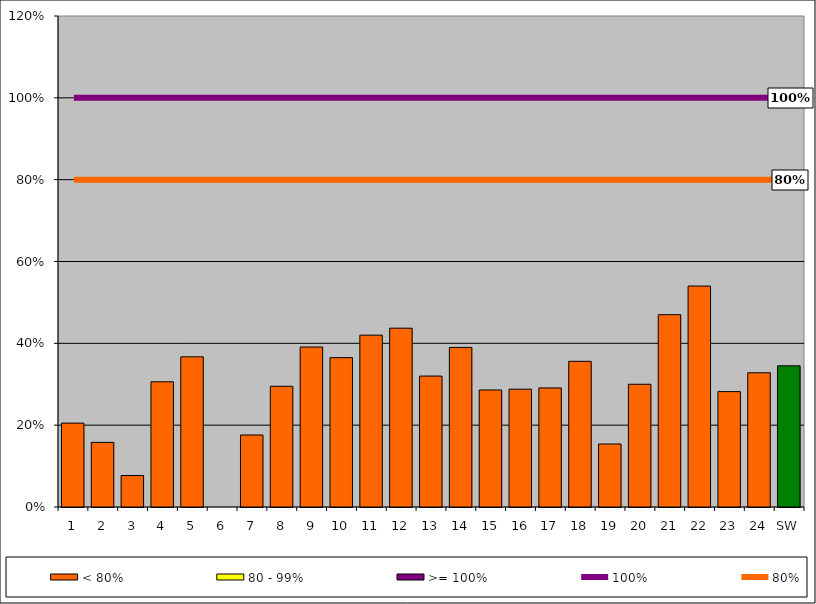
| Category | < 80% | 80 - 99% | >= 100% |
|---|---|---|---|
| 1 | 0.205 | 0 | 0 |
| 2 | 0.158 | 0 | 0 |
| 3 | 0.077 | 0 | 0 |
| 4 | 0.306 | 0 | 0 |
| 5 | 0.367 | 0 | 0 |
| 6 | 0 | 0 | 0 |
| 7 | 0.176 | 0 | 0 |
| 8 | 0.295 | 0 | 0 |
| 9 | 0.391 | 0 | 0 |
| 10 | 0.365 | 0 | 0 |
| 11 | 0.42 | 0 | 0 |
| 12 | 0.437 | 0 | 0 |
| 13 | 0.32 | 0 | 0 |
| 14 | 0.39 | 0 | 0 |
| 15 | 0.286 | 0 | 0 |
| 16 | 0.288 | 0 | 0 |
| 17 | 0.291 | 0 | 0 |
| 18 | 0.356 | 0 | 0 |
| 19 | 0.154 | 0 | 0 |
| 20 | 0.3 | 0 | 0 |
| 21 | 0.47 | 0 | 0 |
| 22 | 0.54 | 0 | 0 |
| 23 | 0.282 | 0 | 0 |
| 24 | 0.328 | 0 | 0 |
| SW | 0.345 | 0 | 0 |